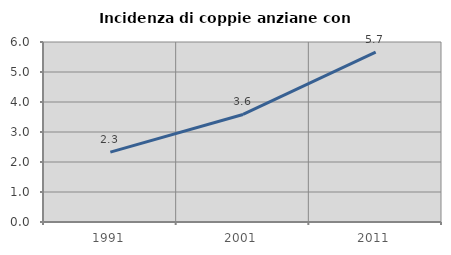
| Category | Incidenza di coppie anziane con figli |
|---|---|
| 1991.0 | 2.328 |
| 2001.0 | 3.585 |
| 2011.0 | 5.661 |